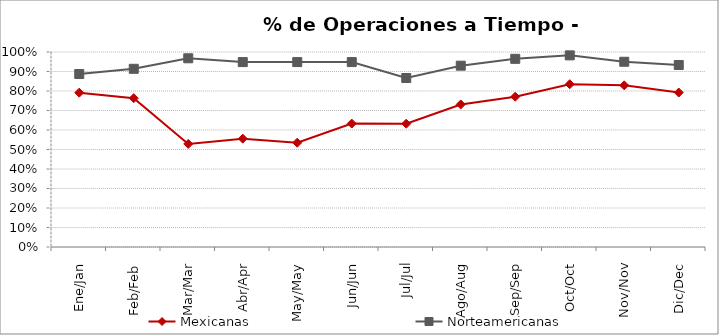
| Category | Mexicanas | Norteamericanas |
|---|---|---|
| Ene/Jan | 0.791 | 0.887 |
| Feb/Feb | 0.763 | 0.914 |
| Mar/Mar | 0.529 | 0.968 |
| Abr/Apr | 0.556 | 0.948 |
| May/May | 0.535 | 0.948 |
| Jun/Jun | 0.633 | 0.948 |
| Jul/Jul | 0.632 | 0.867 |
| Ago/Aug | 0.731 | 0.93 |
| Sep/Sep | 0.771 | 0.965 |
| Oct/Oct | 0.835 | 0.983 |
| Nov/Nov | 0.829 | 0.95 |
| Dic/Dec | 0.792 | 0.933 |